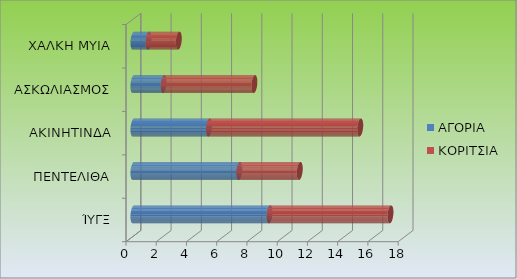
| Category | ΑΓΟΡΙΑ | ΚΟΡΙΤΣΙΑ |
|---|---|---|
| ΊΥΓΞ | 9 | 8 |
| ΠΕΝΤΕΛΙΘΑ | 7 | 4 |
| ΑΚΙΝΗΤΙΝΔΑ | 5 | 10 |
| ΑΣΚΩΛΙΑΣΜΟΣ | 2 | 6 |
| ΧΑΛΚΗ ΜΥΙΑ | 1 | 2 |